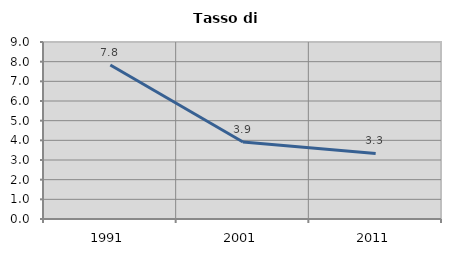
| Category | Tasso di disoccupazione   |
|---|---|
| 1991.0 | 7.83 |
| 2001.0 | 3.915 |
| 2011.0 | 3.336 |